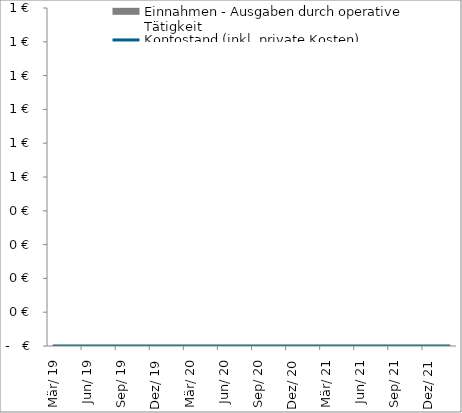
| Category | Einnahmen - Ausgaben durch operative Tätigkeit |
|---|---|
| 2019-03-01 | 0 |
| 2019-04-01 | 0 |
| 2019-05-01 | 0 |
| 2019-06-01 | 0 |
| 2019-07-01 | 0 |
| 2019-08-01 | 0 |
| 2019-09-01 | 0 |
| 2019-10-01 | 0 |
| 2019-11-01 | 0 |
| 2019-12-01 | 0 |
| 2020-01-01 | 0 |
| 2020-02-01 | 0 |
| 2020-03-01 | 0 |
| 2020-04-01 | 0 |
| 2020-05-01 | 0 |
| 2020-06-01 | 0 |
| 2020-07-01 | 0 |
| 2020-08-01 | 0 |
| 2020-09-01 | 0 |
| 2020-10-01 | 0 |
| 2020-11-01 | 0 |
| 2020-12-01 | 0 |
| 2021-01-01 | 0 |
| 2021-02-01 | 0 |
| 2021-03-01 | 0 |
| 2021-04-01 | 0 |
| 2021-05-01 | 0 |
| 2021-06-01 | 0 |
| 2021-07-01 | 0 |
| 2021-08-01 | 0 |
| 2021-09-01 | 0 |
| 2021-10-01 | 0 |
| 2021-11-01 | 0 |
| 2021-12-01 | 0 |
| 2022-01-01 | 0 |
| 2022-02-01 | 0 |